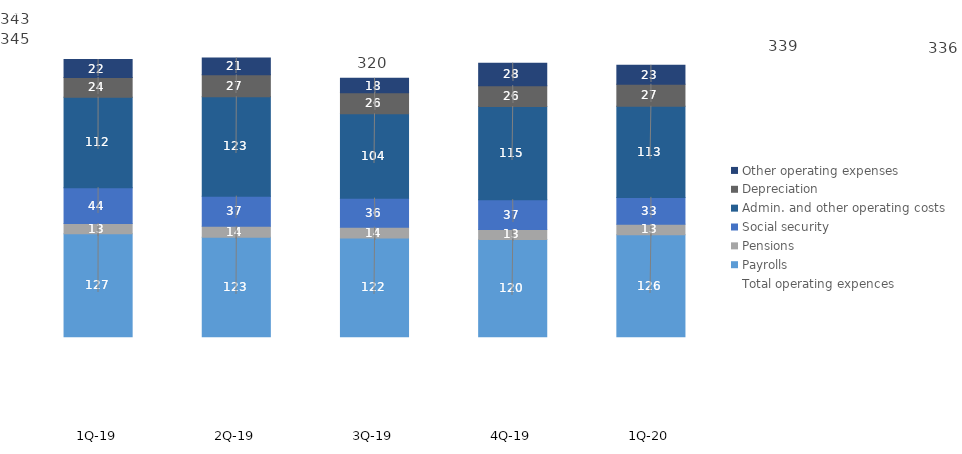
| Category | Payrolls | Pensions | Social security | Admin. and other operating costs | Depreciation | Other operating expenses |
|---|---|---|---|---|---|---|
| 1Q-20 | 126.236 | 12.924 | 33.263 | 112.75 | 27.262 | 23.365 |
| 4Q-19 | 120.223 | 12.54 | 36.799 | 115.196 | 25.974 | 27.802 |
| 3Q-19 | 122.031 | 13.58 | 35.843 | 104.32 | 26.181 | 17.805 |
| 2Q-19 | 123.15 | 13.54 | 37.28 | 122.97 | 27.2 | 20.83 |
| 1Q-19 | 127.289 | 12.805 | 44.276 | 112.059 | 24.33 | 22.21 |